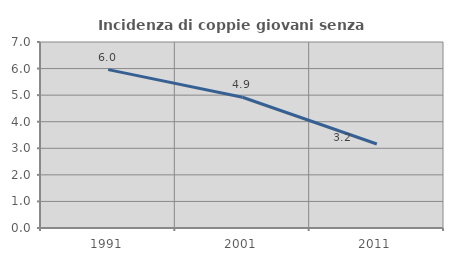
| Category | Incidenza di coppie giovani senza figli |
|---|---|
| 1991.0 | 5.96 |
| 2001.0 | 4.921 |
| 2011.0 | 3.161 |